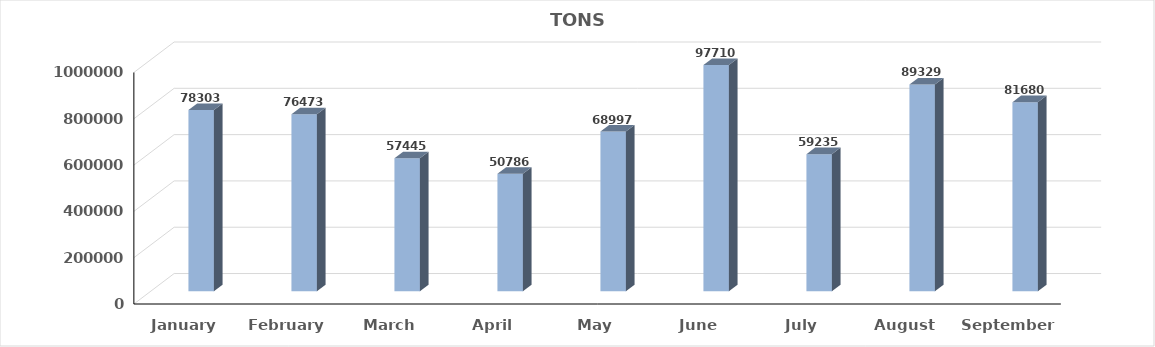
| Category | TONS |
|---|---|
| January | 783032 |
| February | 764733 |
| March | 574457 |
| April | 507865 |
| May | 689973 |
| June | 977105 |
| July | 592353 |
| August | 893298 |
| September | 816806 |